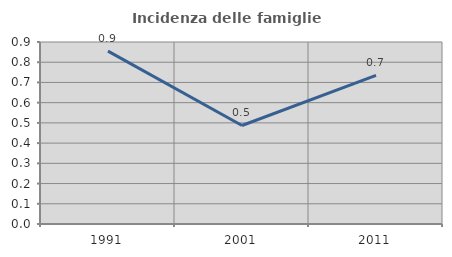
| Category | Incidenza delle famiglie numerose |
|---|---|
| 1991.0 | 0.855 |
| 2001.0 | 0.487 |
| 2011.0 | 0.735 |